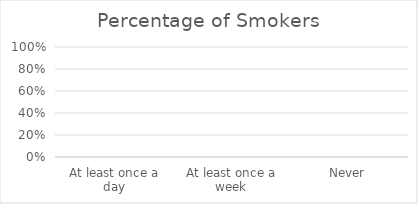
| Category | Series 0 |
|---|---|
| At least once a day | 0 |
| At least once a week | 0 |
| Never | 0 |